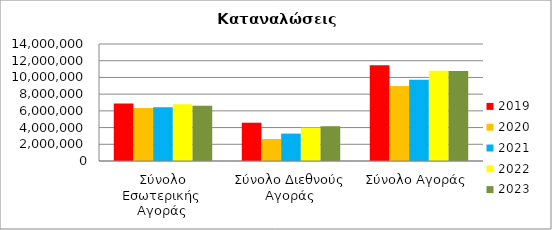
| Category | 2019 | 2020 | 2021 | 2022 | 2023 |
|---|---|---|---|---|---|
| Σύνολο Εσωτερικής Αγοράς | 6874557 | 6340313 | 6433086 | 6801283 | 6603431 |
| Σύνολο Διεθνούς Αγοράς | 4581854 | 2630986 | 3278796 | 3987275 | 4161892 |
| Σύνολο Αγοράς | 11456411 | 8971299 | 9711882 | 10788558 | 10765323 |